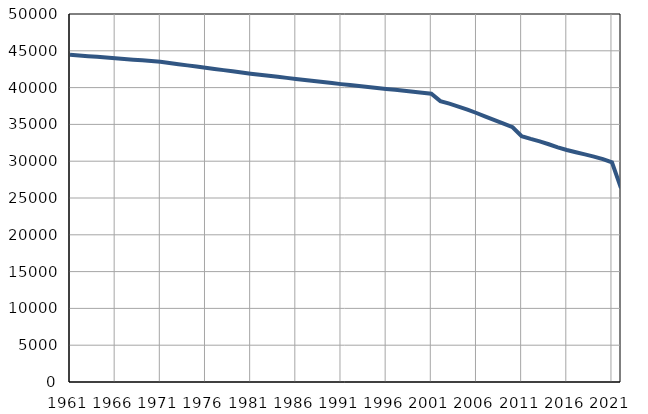
| Category | Population
size |
|---|---|
| 1961.0 | 44466 |
| 1962.0 | 44370 |
| 1963.0 | 44274 |
| 1964.0 | 44179 |
| 1965.0 | 44083 |
| 1966.0 | 43987 |
| 1967.0 | 43891 |
| 1968.0 | 43795 |
| 1969.0 | 43700 |
| 1970.0 | 43604 |
| 1971.0 | 43508 |
| 1972.0 | 43346 |
| 1973.0 | 43184 |
| 1974.0 | 43022 |
| 1975.0 | 42860 |
| 1976.0 | 42699 |
| 1977.0 | 42537 |
| 1978.0 | 42374 |
| 1979.0 | 42213 |
| 1980.0 | 42050 |
| 1981.0 | 41889 |
| 1982.0 | 41747 |
| 1983.0 | 41606 |
| 1984.0 | 41464 |
| 1985.0 | 41323 |
| 1986.0 | 41181 |
| 1987.0 | 41040 |
| 1988.0 | 40898 |
| 1989.0 | 40757 |
| 1990.0 | 40615 |
| 1991.0 | 40473 |
| 1992.0 | 40343 |
| 1993.0 | 40213 |
| 1994.0 | 40083 |
| 1995.0 | 39953 |
| 1996.0 | 39823 |
| 1997.0 | 39694 |
| 1998.0 | 39564 |
| 1999.0 | 39434 |
| 2000.0 | 39304 |
| 2001.0 | 39174 |
| 2002.0 | 38162 |
| 2003.0 | 37824 |
| 2004.0 | 37427 |
| 2005.0 | 37005 |
| 2006.0 | 36550 |
| 2007.0 | 36051 |
| 2008.0 | 35575 |
| 2009.0 | 35099 |
| 2010.0 | 34611 |
| 2011.0 | 33407 |
| 2012.0 | 33028 |
| 2013.0 | 32689 |
| 2014.0 | 32305 |
| 2015.0 | 31884 |
| 2016.0 | 31517 |
| 2017.0 | 31210 |
| 2018.0 | 30927 |
| 2019.0 | 30628 |
| 2020.0 | 30279 |
| 2021.0 | 29853 |
| 2022.0 | 26345 |